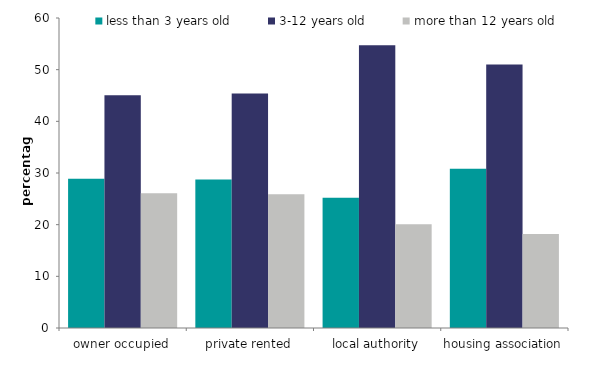
| Category | less than 3 years old | 3-12 years old | more than 12 years old |
|---|---|---|---|
| owner occupied | 28.877 | 45.03 | 26.093 |
| private rented | 28.718 | 45.38 | 25.901 |
| local authority | 25.201 | 54.731 | 20.068 |
| housing association | 30.825 | 50.987 | 18.187 |